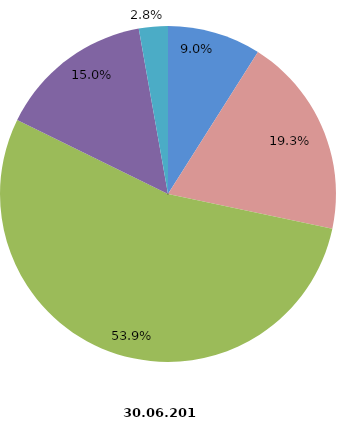
| Category | Beschäftigte 2017 |
|---|---|
| tätige Inhaber und Mitinhaber sowie unbezahlt mithelfende Familienangehörige | 2410 |
| kaufmännische und technische Arbeitnehmer | 5180 |
| Facharbeiter | 14459 |
| Fachwerker und Werker | 4007 |
| gewerblich Auszubildende, Umschüler, Praktikanten | 747 |